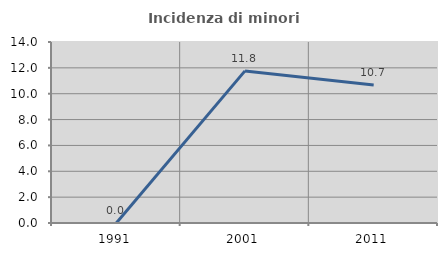
| Category | Incidenza di minori stranieri |
|---|---|
| 1991.0 | 0 |
| 2001.0 | 11.765 |
| 2011.0 | 10.667 |